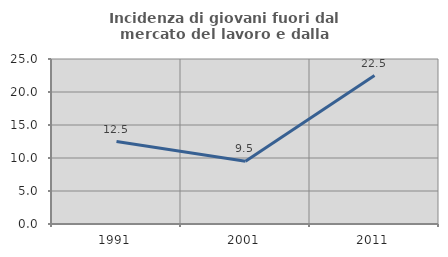
| Category | Incidenza di giovani fuori dal mercato del lavoro e dalla formazione  |
|---|---|
| 1991.0 | 12.5 |
| 2001.0 | 9.524 |
| 2011.0 | 22.5 |